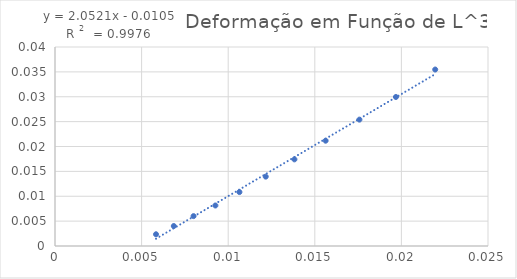
| Category | Deformação (m) |
|---|---|
| 0.021952000000000006 | 0.035 |
| 0.019683000000000003 | 0.03 |
| 0.017576 | 0.025 |
| 0.015625 | 0.021 |
| 0.013824 | 0.017 |
| 0.012167 | 0.014 |
| 0.010648 | 0.011 |
| 0.009260999999999998 | 0.008 |
| 0.008000000000000002 | 0.006 |
| 0.0068590000000000005 | 0.004 |
| 0.0058319999999999995 | 0.002 |